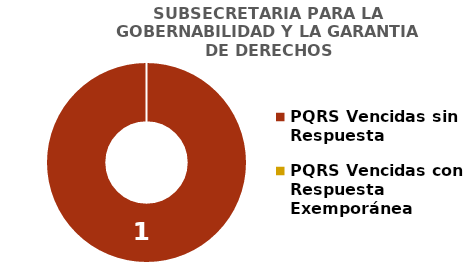
| Category | SUBSECRETARIA PARA LA GOBERNABILIDAD Y LA GARANTIA DE DERECHOS |
|---|---|
| PQRS Vencidas sin Respuesta | 1 |
| PQRS Vencidas con Respuesta Exemporánea | 0 |